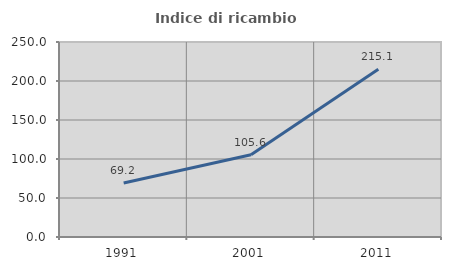
| Category | Indice di ricambio occupazionale  |
|---|---|
| 1991.0 | 69.238 |
| 2001.0 | 105.552 |
| 2011.0 | 215.117 |